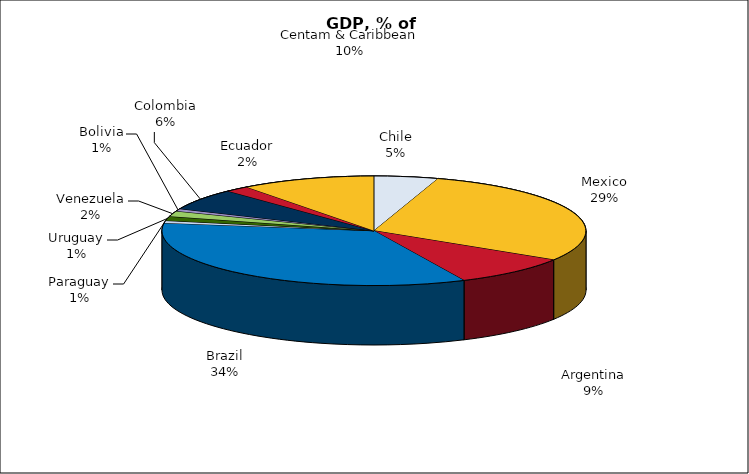
| Category | GDP |
|---|---|
| Chile | 325.723 |
| Mexico | 1932.022 |
| Argentina | 606.828 |
| Brazil | 2281.933 |
| Paraguay | 46.268 |
| Uruguay | 83.166 |
| Venezuela | 108.38 |
| Bolivia | 47.821 |
| Colombia | 420.273 |
| Ecuador | 122.662 |
| Centam & Caribbean | 682.81 |